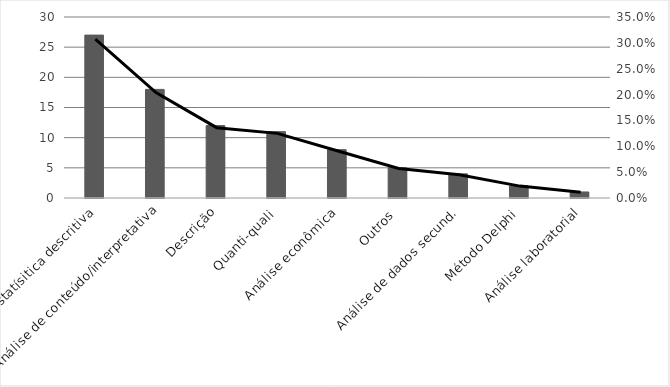
| Category | Series 0 |
|---|---|
| Estatísitica descritiva | 27 |
| Análise de conteúdo/interpretativa | 18 |
| Descrição | 12 |
| Quanti-quali | 11 |
| Análise econômica | 8 |
| Outros | 5 |
| Análise de dados secund. | 4 |
| Método Delphi | 2 |
| Análise laboratorial | 1 |